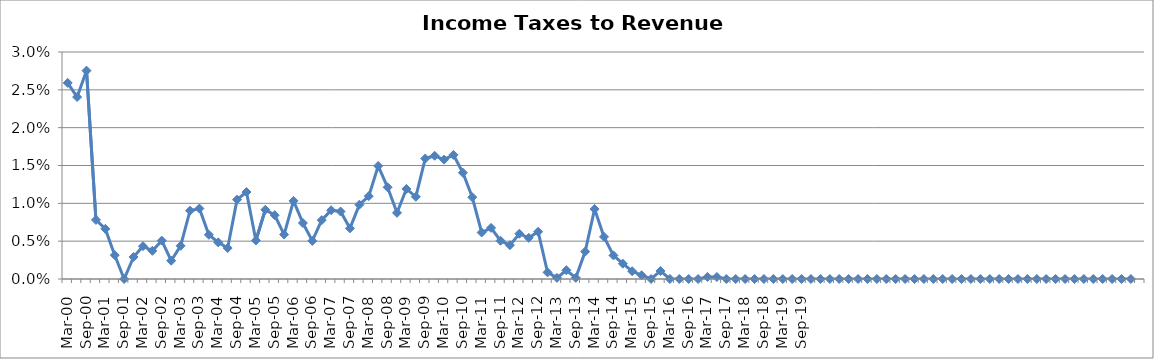
| Category | Income Taxes to Revenue (%) |
|---|---|
| Mar-00 | 0.026 |
| Jun-00 | 0.024 |
| Sep-00 | 0.028 |
| Dec-00 | 0.008 |
| Mar-01 | 0.007 |
| Jun-01 | 0.003 |
| Sep-01 | 0 |
| Dec-01 | 0.003 |
| Mar-02 | 0.004 |
| Jun-02 | 0.004 |
| Sep-02 | 0.005 |
| Dec-02 | 0.002 |
| Mar-03 | 0.004 |
| Jun-03 | 0.009 |
| Sep-03 | 0.009 |
| Dec-03 | 0.006 |
| Mar-04 | 0.005 |
| Jun-04 | 0.004 |
| Sep-04 | 0.01 |
| Dec-04 | 0.011 |
| Mar-05 | 0.005 |
| Jun-05 | 0.009 |
| Sep-05 | 0.008 |
| Dec-05 | 0.006 |
| Mar-06 | 0.01 |
| Jun-06 | 0.007 |
| Sep-06 | 0.005 |
| Dec-06 | 0.008 |
| Mar-07 | 0.009 |
| Jun-07 | 0.009 |
| Sep-07 | 0.007 |
| Dec-07 | 0.01 |
| Mar-08 | 0.011 |
| Jun-08 | 0.015 |
| Sep-08 | 0.012 |
| Dec-08 | 0.009 |
| Mar-09 | 0.012 |
| Jun-09 | 0.011 |
| Sep-09 | 0.016 |
| Dec-09 | 0.016 |
| Mar-10 | 0.016 |
| Jun-10 | 0.016 |
| Sep-10 | 0.014 |
| Dec-10 | 0.011 |
| Mar-11 | 0.006 |
| Jun-11 | 0.007 |
| Sep-11 | 0.005 |
| Dec-11 | 0.004 |
| Mar-12 | 0.006 |
| Jun-12 | 0.005 |
| Sep-12 | 0.006 |
| Dec-12 | 0.001 |
| Mar-13 | 0 |
| Jun-13 | 0.001 |
| Sep-13 | 0 |
| Dec-13 | 0.004 |
| Mar-14 | 0.009 |
| Jun-14 | 0.006 |
| Sep-14 | 0.003 |
| Dec-14 | 0.002 |
| Mar-15 | 0.001 |
| Jun-15 | 0 |
| Sep-15 | 0 |
| Dec-15 | 0.001 |
| Mar-16 | 0 |
| Jun-16 | 0 |
| Sep-16 | 0 |
| Dec-16 | 0 |
| Mar-17 | 0 |
| Jun-17 | 0 |
| Sep-17 | 0 |
| Dec-17 | 0 |
| Mar-18 | 0 |
| Jun-18 | 0 |
| Sep-18 | 0 |
| Dec-18 | 0 |
| Mar-19 | 0 |
| Jun-19 | 0 |
| Sep-19 | 0 |